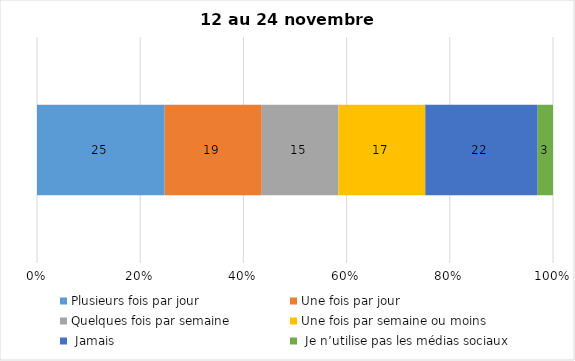
| Category | Plusieurs fois par jour | Une fois par jour | Quelques fois par semaine   | Une fois par semaine ou moins   |  Jamais   |  Je n’utilise pas les médias sociaux |
|---|---|---|---|---|---|---|
| 0 | 25 | 19 | 15 | 17 | 22 | 3 |